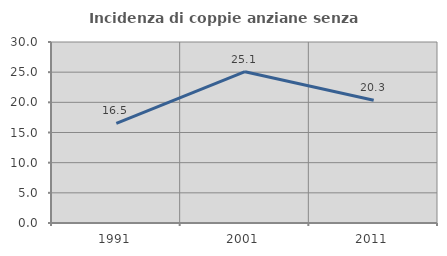
| Category | Incidenza di coppie anziane senza figli  |
|---|---|
| 1991.0 | 16.507 |
| 2001.0 | 25.079 |
| 2011.0 | 20.333 |